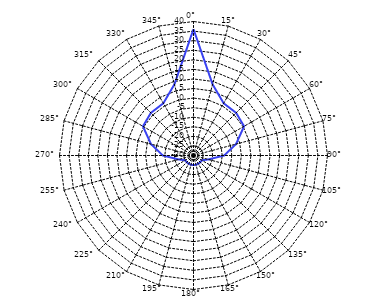
| Category | Series 0 |
|---|---|
| 0° | 36 |
| 15° | 8.5 |
| 30° | 1.5 |
| 45° | 1.5 |
| 60° | 0.5 |
| 75° | -7 |
| 90° | -14 |
| 105° | -22 |
| 120° | -25 |
| 135° | -25 |
| 150° | -25 |
| 165° | -25 |
| 180° | -25 |
| 195° | -25 |
| 210° | -25 |
| 225° | -25 |
| 240° | -25 |
| 255° | -22 |
| 270° | -14 |
| 285° | -7 |
| 300° | 0.5 |
| 315° | 1.5 |
| 330° | 1.5 |
| 345° | 8.5 |